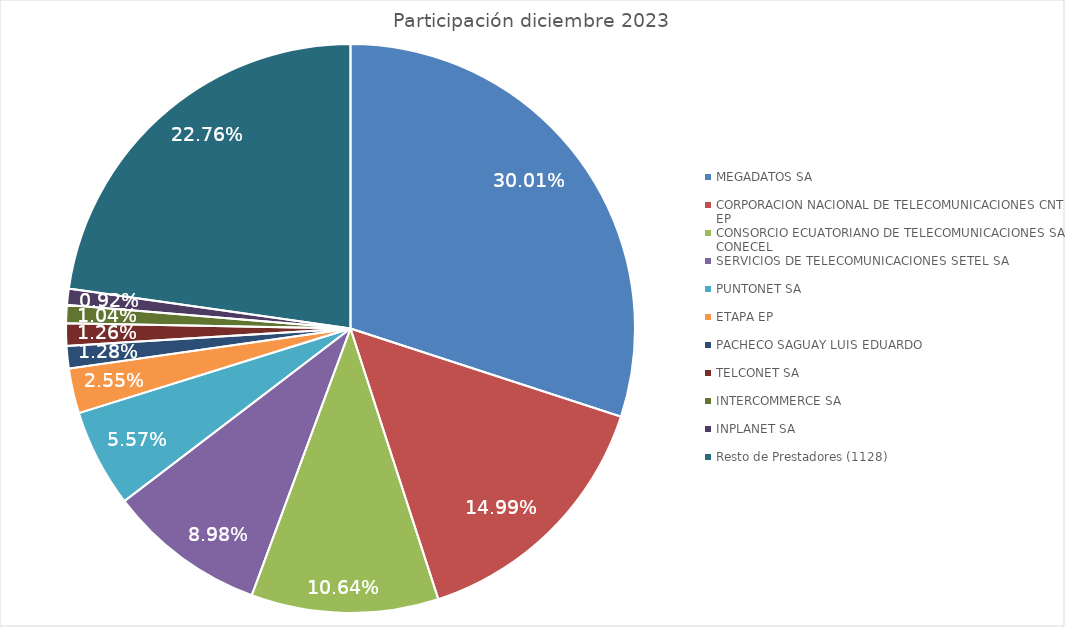
| Category | Series 0 |
|---|---|
| MEGADATOS SA | 867085 |
| CORPORACION NACIONAL DE TELECOMUNICACIONES CNT EP | 433177 |
| CONSORCIO ECUATORIANO DE TELECOMUNICACIONES SA CONECEL | 307269 |
| SERVICIOS DE TELECOMUNICACIONES SETEL SA | 259442 |
| PUNTONET SA | 160946 |
| ETAPA EP | 73781 |
| PACHECO SAGUAY LUIS EDUARDO | 36862 |
| TELCONET SA | 36525 |
| INTERCOMMERCE SA | 29882 |
| INPLANET SA | 26610 |
| Resto de Prestadores (1128) | 657441 |